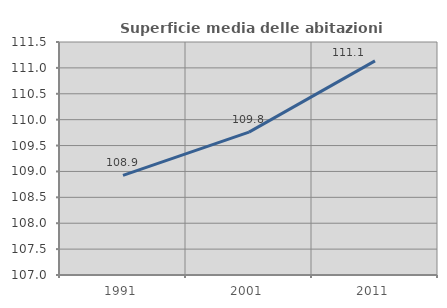
| Category | Superficie media delle abitazioni occupate |
|---|---|
| 1991.0 | 108.923 |
| 2001.0 | 109.76 |
| 2011.0 | 111.136 |